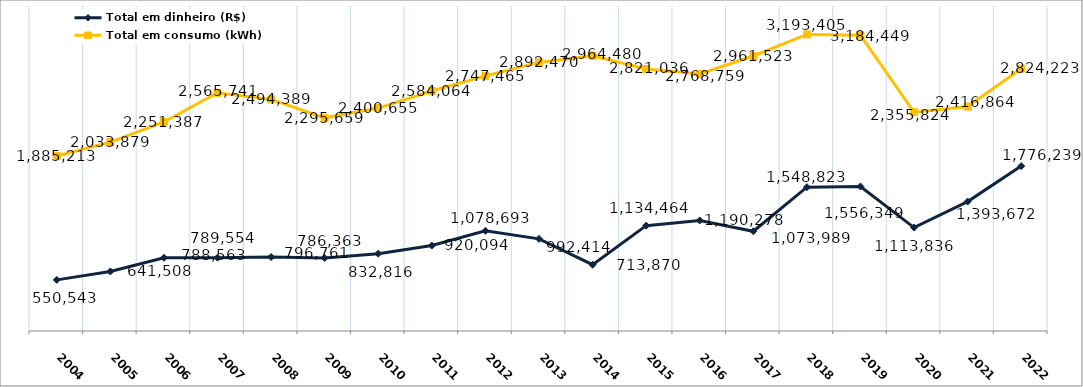
| Category | Total em dinheiro (R$) | Total em consumo (kWh) |
|---|---|---|
| 2004.0 | 550542.69 | 1885213 |
| 2005.0 | 641507.62 | 2033879 |
| 2006.0 | 788563.39 | 2251387 |
| 2007.0 | 789553.84 | 2565741 |
| 2008.0 | 796761.3 | 2494389 |
| 2009.0 | 786362.51 | 2295659 |
| 2010.0 | 832816.11 | 2400655 |
| 2011.0 | 920094.37 | 2584064 |
| 2012.0 | 1078693.45 | 2747465 |
| 2013.0 | 992413.73 | 2892470 |
| 2014.0 | 713870.2 | 2964480 |
| 2015.0 | 1134464.4 | 2821036 |
| 2016.0 | 1190277.91 | 2768759 |
| 2017.0 | 1073989.15 | 2961523 |
| 2018.0 | 1548822.87 | 3193405.37 |
| 2019.0 | 1556349 | 3184449 |
| 2020.0 | 1113835.77 | 2355824 |
| 2021.0 | 1393672.32 | 2416864 |
| 2022.0 | 1776239.04 | 2824223 |